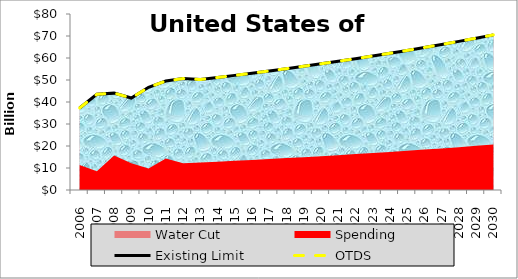
| Category | Existing Limit | OTDS |
|---|---|---|
| 0 | 37275354000 | 37275354000 |
| 1 | 43507358000 | 43507358000 |
| 2 | 44029063000 | 44029063000 |
| 3 | 41804075000 | 41804075000 |
| 4 | 46696855000 | 46696855000 |
| 5 | 49508893000 | 49508893000 |
| 6 | 50668008000 | 50668008000 |
| 7 | 50208429000 | 50208429000 |
| 8 | 51141681870 | 51141681870 |
| 9 | 52102932326.1 | 52102932326.1 |
| 10 | 53093020295.883 | 53093020295.883 |
| 11 | 54112810904.759 | 54112810904.759 |
| 12 | 55163195231.902 | 55163195231.902 |
| 13 | 56245091088.859 | 56245091088.859 |
| 14 | 57359443821.525 | 57359443821.525 |
| 15 | 58507227136.171 | 58507227136.171 |
| 16 | 59689443950.256 | 59689443950.256 |
| 17 | 60907127268.764 | 60907127268.764 |
| 18 | 62161341086.827 | 62161341086.827 |
| 19 | 63453181319.431 | 63453181319.431 |
| 20 | 64783776759.014 | 64783776759.014 |
| 21 | 66154290061.785 | 66154290061.785 |
| 22 | 67565918763.638 | 67565918763.638 |
| 23 | 69019896326.547 | 69019896326.547 |
| 24 | 70517493216.344 | 70517493216.344 |